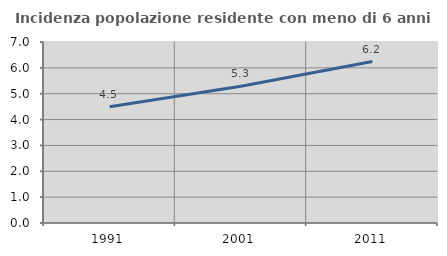
| Category | Incidenza popolazione residente con meno di 6 anni |
|---|---|
| 1991.0 | 4.496 |
| 2001.0 | 5.286 |
| 2011.0 | 6.246 |